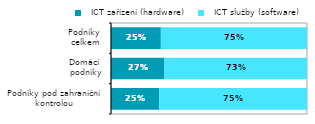
| Category |   ICT zařízení (hardware) |   ICT služby (software) |
|---|---|---|
| Podniky pod zahraniční 
kontrolou | 0.246 | 0.754 |
| Domácí 
podniky | 0.273 | 0.727 |
| Podniky 
celkem | 0.254 | 0.746 |